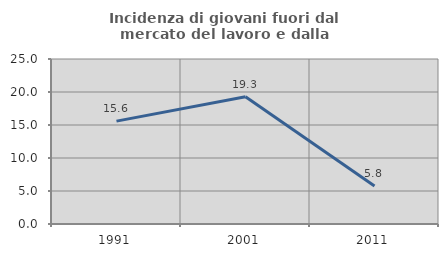
| Category | Incidenza di giovani fuori dal mercato del lavoro e dalla formazione  |
|---|---|
| 1991.0 | 15.584 |
| 2001.0 | 19.286 |
| 2011.0 | 5.769 |